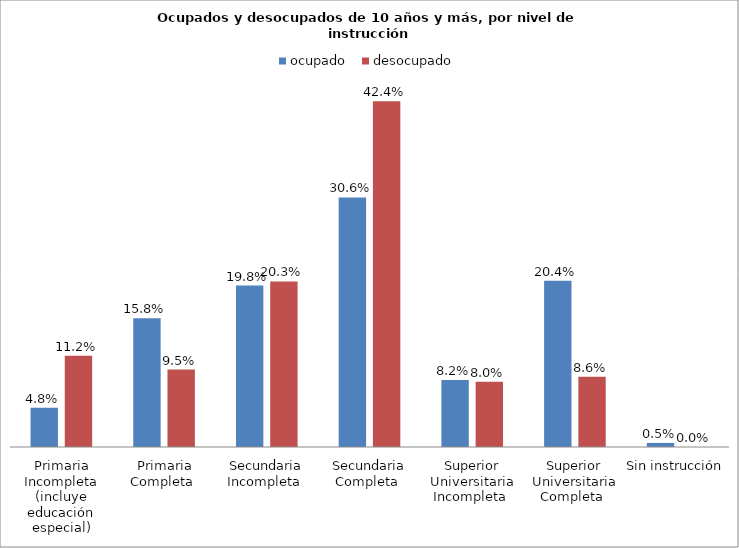
| Category | ocupado  | desocupado |
|---|---|---|
| Primaria Incompleta (incluye educación especial) | 0.048 | 0.112 |
| Primaria Completa  | 0.158 | 0.095 |
| Secundaria Incompleta  | 0.198 | 0.203 |
| Secundaria Completa  | 0.306 | 0.424 |
| Superior Universitaria Incompleta  | 0.082 | 0.08 |
| Superior Universitaria Completa  | 0.204 | 0.086 |
| Sin instrucción  | 0.005 | 0 |